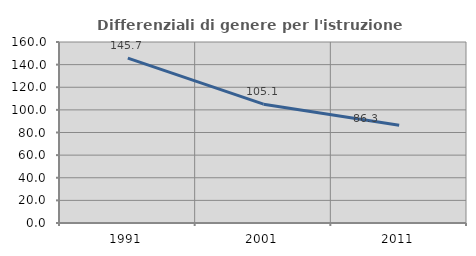
| Category | Differenziali di genere per l'istruzione superiore |
|---|---|
| 1991.0 | 145.704 |
| 2001.0 | 105.051 |
| 2011.0 | 86.339 |